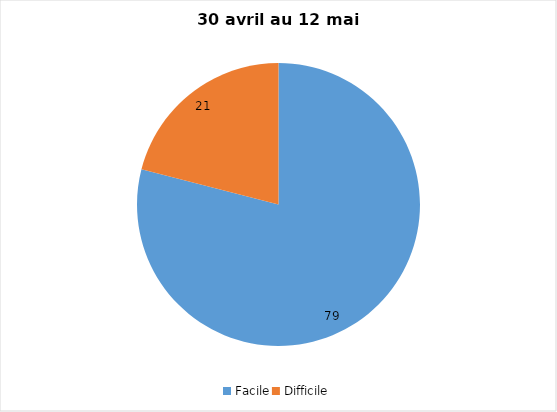
| Category | Series 0 |
|---|---|
| Facile | 79 |
| Difficile | 21 |